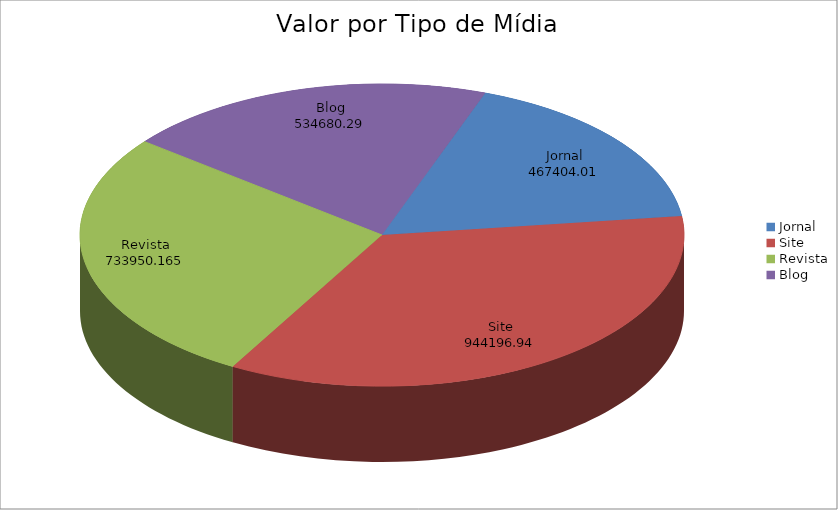
| Category | Series 0 |
|---|---|
| Jornal | 467404.01 |
| Site | 944196.94 |
| Revista | 733950.165 |
| Blog | 534680.29 |